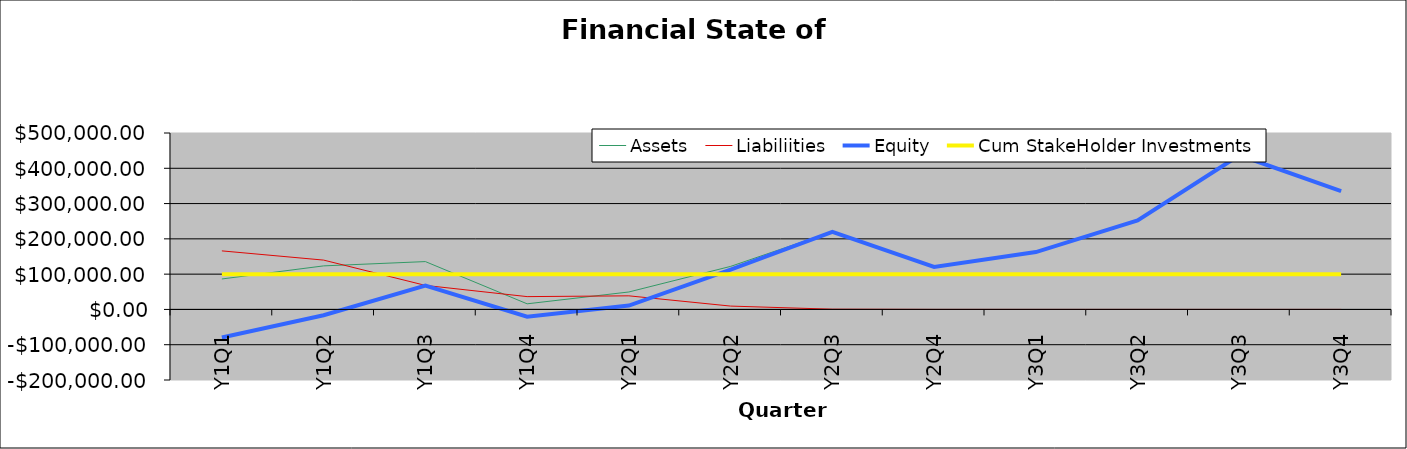
| Category | Assets | Liabiliities | Equity | Cum StakeHolder Investments |
|---|---|---|---|---|
| Y1Q1 | 86300 | 165913.206 | -79613.206 | 100000 |
| Y1Q2 | 123400 | 139773.834 | -16373.834 | 100000 |
| Y1Q3 | 135600 | 68099.153 | 67500.847 | 100000 |
| Y1Q4 | 15900 | 36289.152 | -20389.152 | 100000 |
| Y2Q1 | 49480.66 | 38511.863 | 10968.797 | 100000 |
| Y2Q2 | 122000 | 9454.9 | 112545.1 | 100000 |
| Y2Q3 | 220615.832 | 661.843 | 219953.989 | 100000 |
| Y2Q4 | 120635.106 | 41.365 | 120593.741 | 100000 |
| Y3Q1 | 162467.463 | 2.43 | 162465.033 | 100000 |
| Y3Q2 | 252082.767 | 0.131 | 252082.637 | 100000 |
| Y3Q3 | 436935.643 | 0.007 | 436935.636 | 100000 |
| Y3Q4 | 335018.384 | 0 | 335018.384 | 100000 |